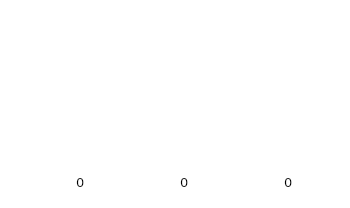
| Category | Series 0 |
|---|---|
| Year 1 | 0 |
| Year 2 | 0 |
| Year 3 | 0 |